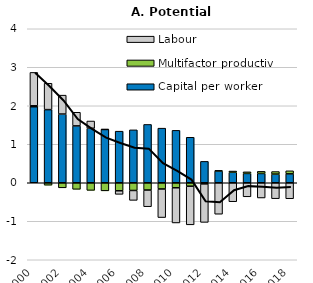
| Category | Capital per worker | Multifactor productivity | Labour |
|---|---|---|---|
| 2000.0 | 1.974 | 0.025 | 0.867 |
| 2001.0 | 1.9 | -0.063 | 0.685 |
| 2002.0 | 1.785 | -0.131 | 0.491 |
| 2003.0 | 1.477 | -0.17 | 0.354 |
| 2004.0 | 1.415 | -0.198 | 0.189 |
| 2005.0 | 1.384 | -0.21 | 0.005 |
| 2006.0 | 1.34 | -0.208 | -0.093 |
| 2007.0 | 1.374 | -0.2 | -0.257 |
| 2008.0 | 1.515 | -0.19 | -0.433 |
| 2009.0 | 1.418 | -0.162 | -0.742 |
| 2010.0 | 1.361 | -0.13 | -0.914 |
| 2011.0 | 1.182 | -0.089 | -1.004 |
| 2012.0 | 0.556 | -0.03 | -1 |
| 2013.0 | 0.307 | 0.01 | -0.817 |
| 2014.0 | 0.272 | 0.032 | -0.493 |
| 2015.0 | 0.242 | 0.041 | -0.365 |
| 2016.0 | 0.241 | 0.055 | -0.395 |
| 2017.0 | 0.225 | 0.066 | -0.414 |
| 2018.0 | 0.231 | 0.079 | -0.415 |